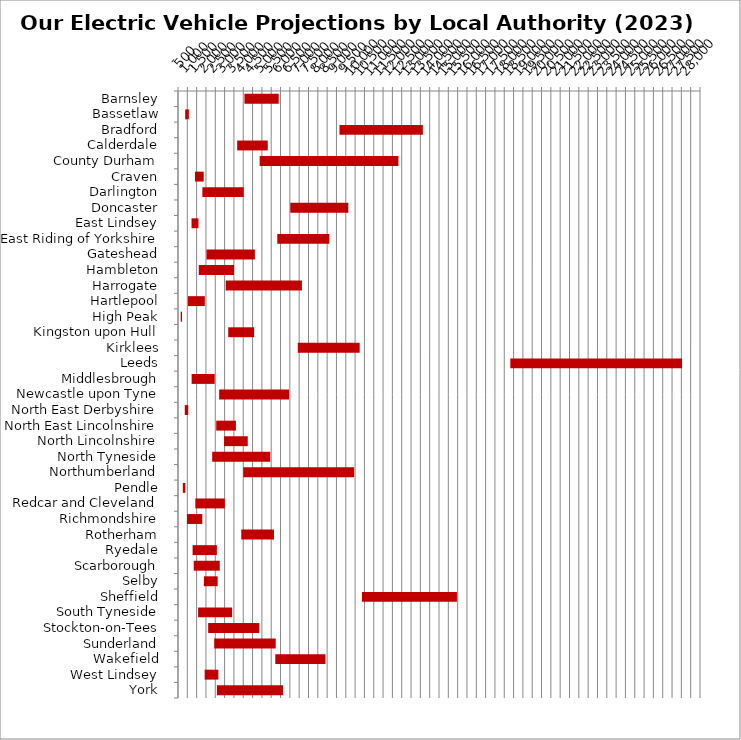
| Category | MIN | MAX |
|---|---|---|
| Barnsley | 3564 | 1838 |
| Bassetlaw | 384 | 198 |
| Bradford | 8660 | 4472 |
| Calderdale | 3175 | 1639 |
| County Durham | 4380 | 7444 |
| Craven | 909 | 470 |
| Darlington | 1308 | 2219 |
| Doncaster | 6024 | 3112 |
| East Lindsey | 726 | 372 |
| East Riding of Yorkshire | 5326 | 2790 |
| Gateshead | 1529 | 2594 |
| Hambleton | 1114 | 1891 |
| Harrogate | 2560 | 4088 |
| Hartlepool | 533 | 906 |
| High Peak | 143 | 74 |
| Kingston upon Hull | 2694 | 1390 |
| Kirklees | 6424 | 3322 |
| Leeds | 17824 | 9212 |
| Middlesbrough | 731 | 1237 |
| Newcastle upon Tyne | 2207 | 3747 |
| North East Derbyshire | 363 | 187 |
| North East Lincolnshire | 2050 | 1057 |
| North Lincolnshire | 2469 | 1272 |
| North Tyneside | 1835 | 3114 |
| Northumberland | 3501 | 5949 |
| Pendle | 260 | 133 |
| Redcar and Cleveland | 930 | 1580 |
| Richmondshire | 482 | 820 |
| Rotherham | 3394 | 1754 |
| Ryedale | 783 | 1302 |
| Scarborough | 844 | 1395 |
| Selby | 1390 | 737 |
| Sheffield | 9864 | 5098 |
| South Tyneside | 1078 | 1825 |
| Stockton-on-Tees | 1617 | 2743 |
| Sunderland | 1943 | 3299 |
| Wakefield | 5219 | 2692 |
| West Lindsey | 1430 | 736 |
| York | 2087 | 3544 |